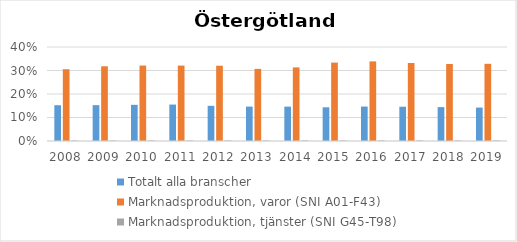
| Category | Totalt alla branscher | Marknadsproduktion, varor (SNI A01-F43) | Marknadsproduktion, tjänster (SNI G45-T98) |
|---|---|---|---|
| 2008 | 0.152 | 0.305 | 0.002 |
| 2009 | 0.153 | 0.318 | 0.002 |
| 2010 | 0.154 | 0.321 | 0.002 |
| 2011 | 0.155 | 0.321 | 0.002 |
| 2012 | 0.15 | 0.32 | 0.002 |
| 2013 | 0.146 | 0.307 | 0.003 |
| 2014 | 0.146 | 0.313 | 0.003 |
| 2015 | 0.143 | 0.334 | 0.002 |
| 2016 | 0.147 | 0.339 | 0.003 |
| 2017 | 0.146 | 0.332 | 0.003 |
| 2018 | 0.144 | 0.328 | 0.003 |
| 2019 | 0.142 | 0.328 | 0.003 |